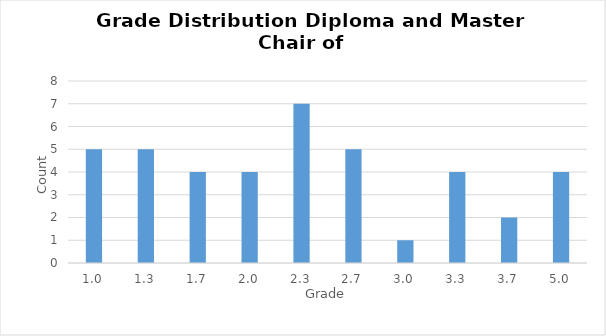
| Category | Häufigkeit |
|---|---|
| 1.0 | 5 |
| 1.3 | 5 |
| 1.7 | 4 |
| 2.0 | 4 |
| 2.3 | 7 |
| 2.7 | 5 |
| 3.0 | 1 |
| 3.3 | 4 |
| 3.7 | 2 |
| 5.0 | 4 |